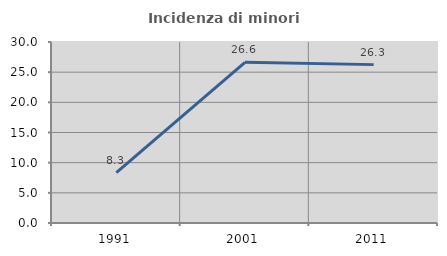
| Category | Incidenza di minori stranieri |
|---|---|
| 1991.0 | 8.333 |
| 2001.0 | 26.636 |
| 2011.0 | 26.25 |